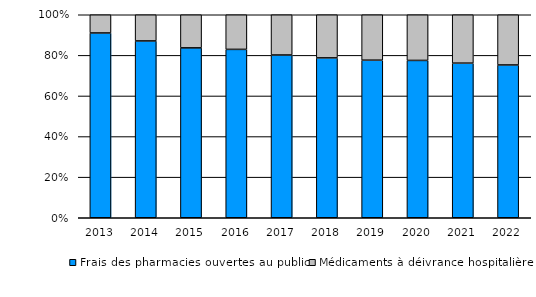
| Category | Frais des pharmacies ouvertes au public | Médicaments à déivrance hospitalière |
|---|---|---|
| 2013.0 | 0.91 | 0.09 |
| 2014.0 | 0.871 | 0.129 |
| 2015.0 | 0.837 | 0.163 |
| 2016.0 | 0.829 | 0.171 |
| 2017.0 | 0.802 | 0.198 |
| 2018.0 | 0.787 | 0.213 |
| 2019.0 | 0.776 | 0.224 |
| 2020.0 | 0.775 | 0.225 |
| 2021.0 | 0.762 | 0.238 |
| 2022.0 | 0.753 | 0.247 |